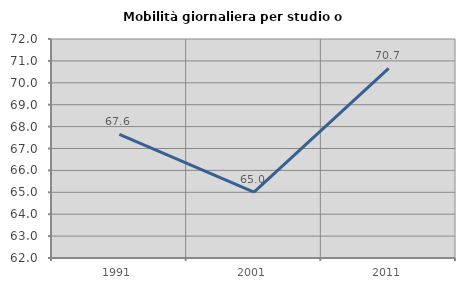
| Category | Mobilità giornaliera per studio o lavoro |
|---|---|
| 1991.0 | 67.647 |
| 2001.0 | 65.012 |
| 2011.0 | 70.663 |